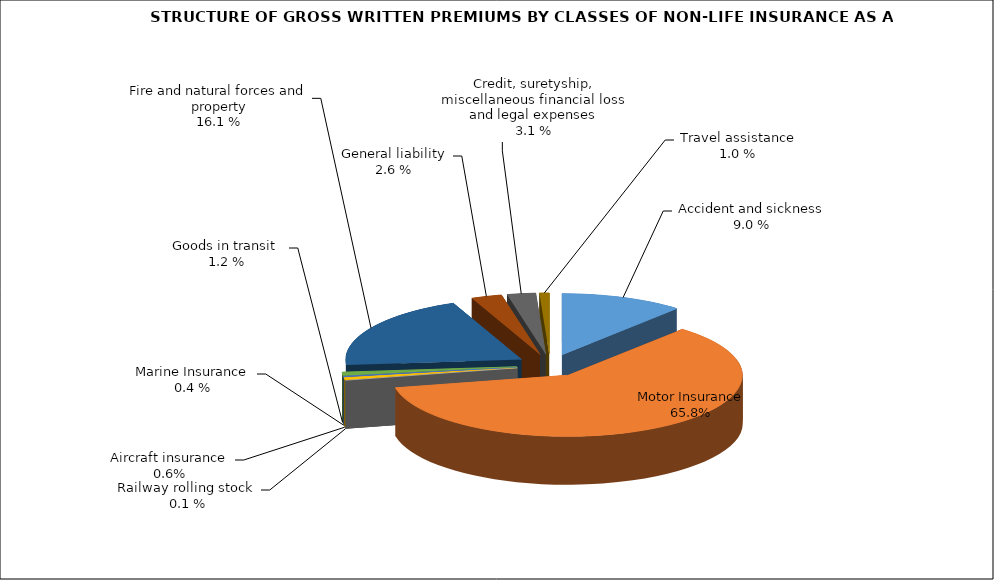
| Category | Злополука и заболяване МПС Релсови превозни средства Летателни апарати Плаванелни съдове Товари по време на превоз Пожар и природни бедствия и други щети на имущество Обща гражданска отговорност Кредити, гаранции, разни финансови загуби и правни разноски |
|---|---|
| Злополука и заболяване | 0.113 |
| МПС | 0.604 |
| Релсови превозни средства | 0 |
| Летателни апарати | 0.006 |
| Плаванелни съдове | 0.003 |
| Товари по време на превоз | 0.009 |
| Пожар и природни бедствия и други щети на имущество | 0.201 |
| Обща гражданска отговорност | 0.028 |
| Кредити, гаранции, разни финансови загуби и правни разноски | 0.026 |
| Помощ при пътуване | 0.009 |